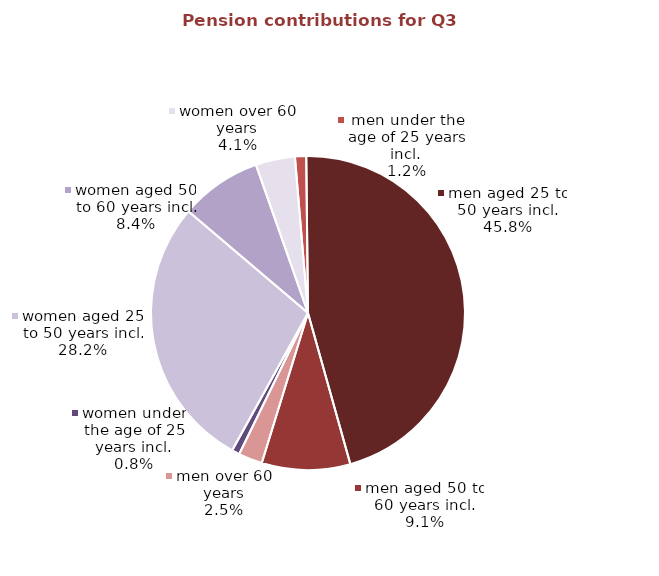
| Category | Series 0 |
|---|---|
| women under the age of 25 years incl. | 0.811 |
| women aged 25 to 50 years incl. | 28.518 |
| women aged 50 to 60 years incl. | 8.512 |
| women over 60 years | 4.095 |
| men under the age of 25 years incl. | 1.167 |
| men aged 25 to 50 years incl. | 46.368 |
| men aged 50 to 60 years incl. | 9.215 |
| men over 60 years | 2.493 |